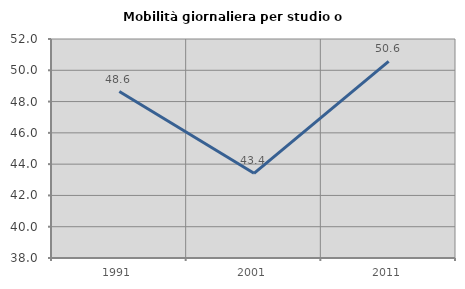
| Category | Mobilità giornaliera per studio o lavoro |
|---|---|
| 1991.0 | 48.641 |
| 2001.0 | 43.415 |
| 2011.0 | 50.569 |